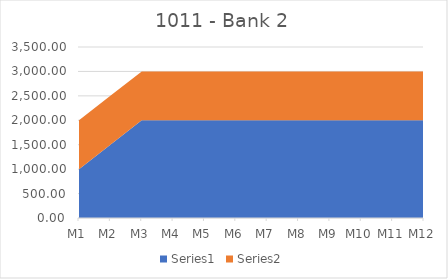
| Category | Series 0 | Series 1 |
|---|---|---|
| M1 | 1000 | 1000 |
| M2 | 1500 | 1000 |
| M3 | 2000 | 1000 |
| M4 | 2000 | 1000 |
| M5 | 2000 | 1000 |
| M6 | 2000 | 1000 |
| M7 | 2000 | 1000 |
| M8 | 2000 | 1000 |
| M9 | 2000 | 1000 |
| M10 | 2000 | 1000 |
| M11 | 2000 | 1000 |
| M12 | 2000 | 1000 |